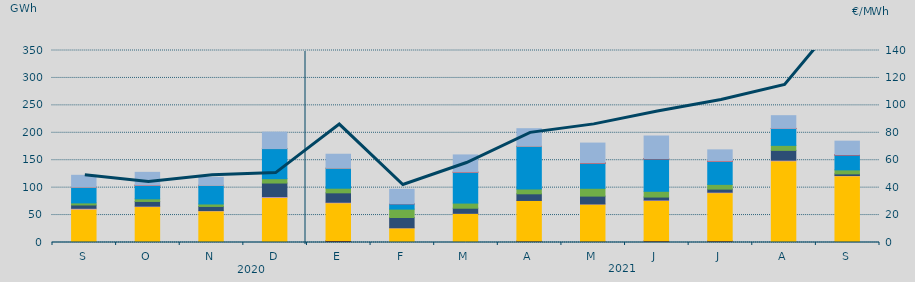
| Category | Carbón | Ciclo Combinado | Cogeneración | Consumo Bombeo | Eólica | Hidráulica | Nuclear | Otras Renovables | Solar fotovoltaica | Solar térmica | Turbinación bombeo |
|---|---|---|---|---|---|---|---|---|---|---|---|
| S | 54.7 | 60777.7 | 1507.9 | 6085.9 | 3725.9 | 28681.9 | 75 | 8 | 25.7 | 0 | 21527.4 |
| O | 27.3 | 65427.4 | 840.9 | 8534.6 | 4755.7 | 24804.7 | 0 | 0 | 8 | 2.5 | 23457.4 |
| N | 575.3 | 57009.7 | 618 | 7516.8 | 4494.6 | 33922.4 | 5.6 | 0.3 | 7.2 | 0 | 14589.5 |
| D | 160.3 | 81818 | 1565.6 | 24860.4 | 7908.5 | 54934.2 | 0 | 0 | 16.2 | 0 | 29926.3 |
| E | 3748.2 | 68568.9 | 1069.7 | 17152.7 | 8410.7 | 36501.6 | 0 | 0 | 17.1 | 0 | 25434.1 |
| F | 157.3 | 26400.8 | 340.9 | 18712.8 | 15219.5 | 9567.8 | 385.9 | 10.9 | 5.9 | 0 | 26182.8 |
| M | 78 | 53067.4 | 76.2 | 9280.8 | 9333.3 | 56450.9 | 0 | 0 | 10.4 | 1.5 | 31341 |
| A | 2888.1 | 73739.7 | 28.3 | 12095.3 | 8894.2 | 77474.8 | 318.8 | 0 | 38.3 | 0 | 31952 |
| M | 2053.3 | 67958.4 | 263.7 | 14305.7 | 14218.9 | 46046.2 | 17.7 | 0 | 25.2 | 0.8 | 36356.3 |
| J | 3099.9 | 73420.8 | 945.7 | 5396.8 | 10467.9 | 59211 | 213.6 | 0 | 36.8 | 55.4 | 41268.2 |
| J | 3046.5 | 87665.5 | 1010.8 | 5572.7 | 8671.4 | 41981.5 | 296.5 | 0 | 8.5 | 116.7 | 20483.6 |
| A | 1481.1 | 147327 | 1240.2 | 17886.3 | 9117.1 | 30800.2 | 0 | 0 | 64.2 | 91.5 | 23170.3 |
| S | 929.2 | 120567.6 | 582.6 | 3027.8 | 7256.6 | 27279.3 | 289.1 | 9.8 | 66.3 | 68.7 | 24660.8 |